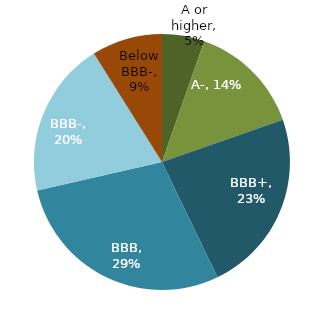
| Category | Series 0 |
|---|---|
| A or higher | 0.054 |
| A- | 0.143 |
| BBB+ | 0.232 |
| BBB | 0.286 |
| BBB- | 0.196 |
| Below BBB- | 0.089 |